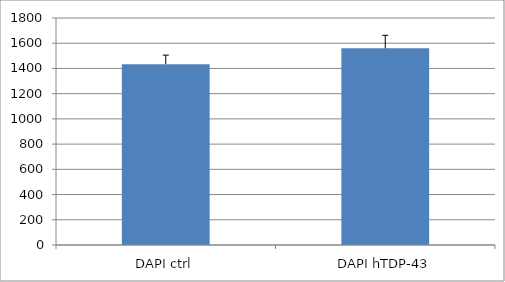
| Category | Series 0 |
|---|---|
| DAPI ctrl | 1434.222 |
| DAPI hTDP-43 | 1560 |